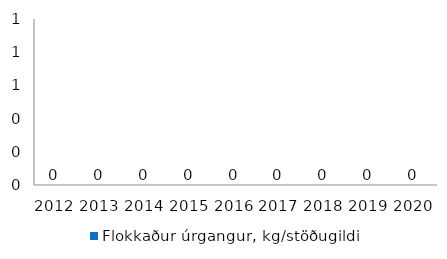
| Category | Flokkaður úrgangur, kg/stöðugildi |
|---|---|
| 2012.0 | 0 |
| 2013.0 | 0 |
| 2014.0 | 0 |
| 2015.0 | 0 |
| 2016.0 | 0 |
| 2017.0 | 0 |
| 2018.0 | 0 |
| 2019.0 | 0 |
| 2020.0 | 0 |